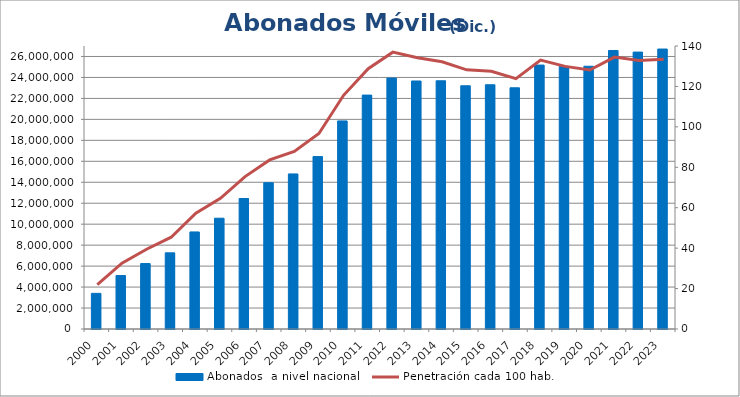
| Category | Abonados  a nivel nacional  |
|---|---|
| 2000.0 | 3401525 |
| 2001.0 | 5100783 |
| 2002.0 | 6244310 |
| 2003.0 | 7268281 |
| 2004.0 | 9261385 |
| 2005.0 | 10569572 |
| 2006.0 | 12450801 |
| 2007.0 | 13955202 |
| 2008.0 | 14796593 |
| 2009.0 | 16450223 |
| 2010.0 | 19852242 |
| 2011.0 | 22315248 |
| 2012.0 | 23940973 |
| 2013.0 | 23661339 |
| 2014.0 | 23680718 |
| 2015.0 | 23206353 |
| 2016.0 | 23302603 |
| 2017.0 | 23013147 |
| 2018.0 | 25178981 |
| 2019.0 | 25051668 |
| 2020.0 | 25068249 |
| 2021.0 | 26571823 |
| 2022.0 | 26418944 |
| 2023.0 | 26710679 |